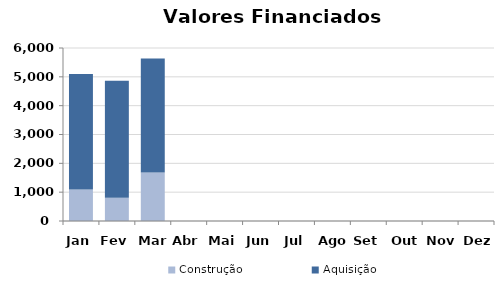
| Category | Construção | Aquisição  |
|---|---|---|
| Jan | 1091.225 | 4005.43 |
| Fev | 806.874 | 4059.044 |
| Mar | 1684.1 | 3954.7 |
| Abr | 0 | 0 |
| Mai | 0 | 0 |
| Jun | 0 | 0 |
| Jul | 0 | 0 |
| Ago | 0 | 0 |
| Set | 0 | 0 |
| Out | 0 | 0 |
| Nov | 0 | 0 |
| Dez | 0 | 0 |